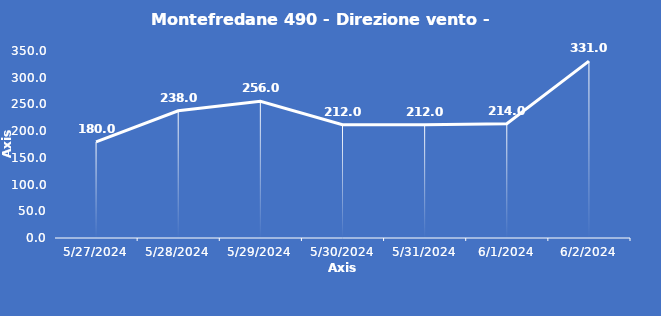
| Category | Montefredane 490 - Direzione vento - Grezzo (°N) |
|---|---|
| 5/27/24 | 180 |
| 5/28/24 | 238 |
| 5/29/24 | 256 |
| 5/30/24 | 212 |
| 5/31/24 | 212 |
| 6/1/24 | 214 |
| 6/2/24 | 331 |